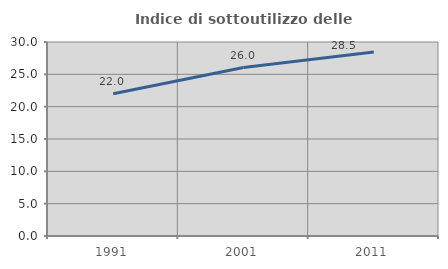
| Category | Indice di sottoutilizzo delle abitazioni  |
|---|---|
| 1991.0 | 21.991 |
| 2001.0 | 26.048 |
| 2011.0 | 28.451 |